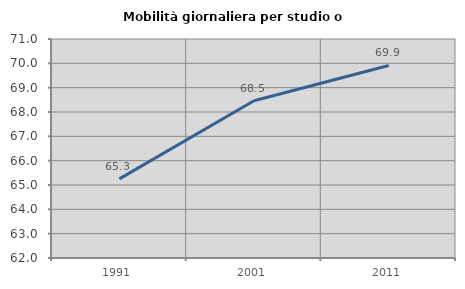
| Category | Mobilità giornaliera per studio o lavoro |
|---|---|
| 1991.0 | 65.252 |
| 2001.0 | 68.46 |
| 2011.0 | 69.913 |